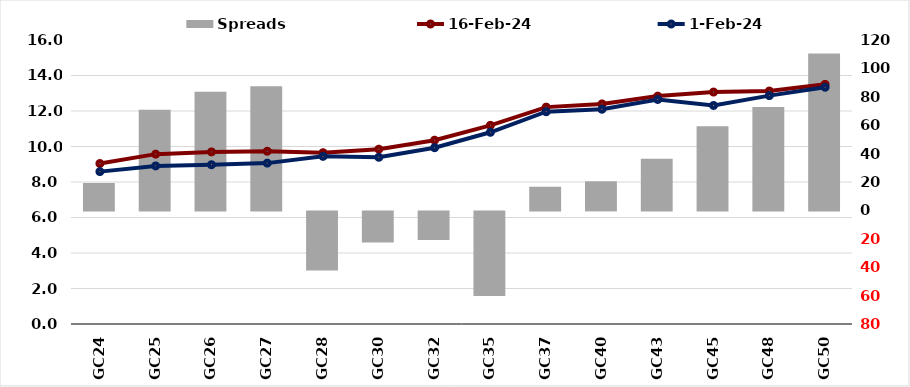
| Category |  Spreads   |
|---|---|
| GC24 | 19.259 |
| GC25 | 70.922 |
| GC26 | 83.622 |
| GC27 | 87.369 |
| GC28 | -41.691 |
| GC30 | -21.869 |
| GC32 | -20.144 |
| GC35 | -59.512 |
| GC37 | 16.571 |
| GC40 | 20.493 |
| GC43 | 36.376 |
| GC45 | 59.228 |
| GC48 | 72.764 |
| GC50 | 110.427 |